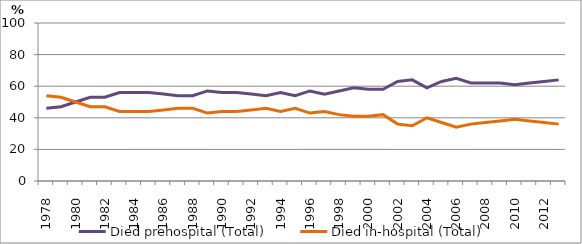
| Category | Died prehospital (Total) | Died in-hospital (Total) |
|---|---|---|
| 1978.0 | 46 | 54 |
| 1979.0 | 47 | 53 |
| 1980.0 | 50 | 50 |
| 1981.0 | 53 | 47 |
| 1982.0 | 53 | 47 |
| 1983.0 | 56 | 44 |
| 1984.0 | 56 | 44 |
| 1985.0 | 56 | 44 |
| 1986.0 | 55 | 45 |
| 1987.0 | 54 | 46 |
| 1988.0 | 54 | 46 |
| 1989.0 | 57 | 43 |
| 1990.0 | 56 | 44 |
| 1991.0 | 56 | 44 |
| 1992.0 | 55 | 45 |
| 1993.0 | 54 | 46 |
| 1994.0 | 56 | 44 |
| 1995.0 | 54 | 46 |
| 1996.0 | 57 | 43 |
| 1997.0 | 55 | 44 |
| 1998.0 | 57 | 42 |
| 1999.0 | 59 | 41 |
| 2000.0 | 58 | 41 |
| 2001.0 | 58 | 42 |
| 2002.0 | 63 | 36 |
| 2003.0 | 64 | 35 |
| 2004.0 | 59 | 40 |
| 2005.0 | 63 | 37 |
| 2006.0 | 65 | 34 |
| 2007.0 | 62 | 36 |
| 2008.0 | 62 | 37 |
| 2009.0 | 62 | 38 |
| 2010.0 | 61 | 39 |
| 2011.0 | 62 | 38 |
| 2012.0 | 63 | 37 |
| 2013.0 | 64 | 36 |